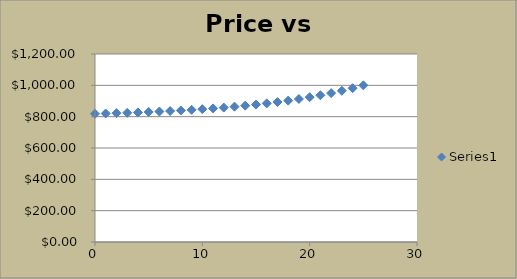
| Category | Series 0 |
|---|---|
| 0.0 | 818.459 |
| 1.0 | 820.305 |
| 2.0 | 822.336 |
| 3.0 | 824.569 |
| 4.0 | 827.026 |
| 5.0 | 829.729 |
| 6.0 | 832.702 |
| 7.0 | 835.972 |
| 8.0 | 839.569 |
| 9.0 | 843.526 |
| 10.0 | 847.878 |
| 11.0 | 852.666 |
| 12.0 | 857.933 |
| 13.0 | 863.726 |
| 14.0 | 870.099 |
| 15.0 | 877.109 |
| 16.0 | 884.82 |
| 17.0 | 893.301 |
| 18.0 | 902.632 |
| 19.0 | 912.895 |
| 20.0 | 924.184 |
| 21.0 | 936.603 |
| 22.0 | 950.263 |
| 23.0 | 965.289 |
| 24.0 | 981.818 |
| 25.0 | 1000 |